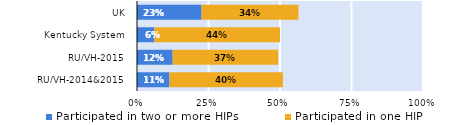
| Category | Participated in two or more HIPs | Participated in one HIP |
|---|---|---|
| RU/VH-2014&2015 | 0.113 | 0.397 |
| RU/VH-2015 | 0.125 | 0.369 |
| Kentucky System | 0.061 | 0.439 |
| UK | 0.226 | 0.339 |